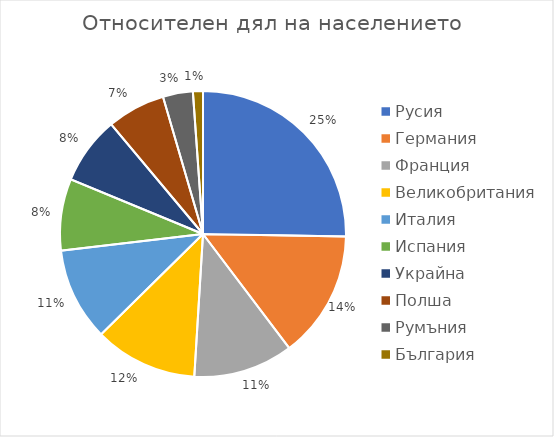
| Category | Series 0 |
|---|---|
| Русия | 145.734 |
| Германия | 83.124 |
| Франция | 64.991 |
| Великобритания | 67.142 |
| Италия | 60.627 |
| Испания | 46.693 |
| Украйна | 44.246 |
| Полша | 37.922 |
| Румъния | 19.506 |
| България | 6.52 |